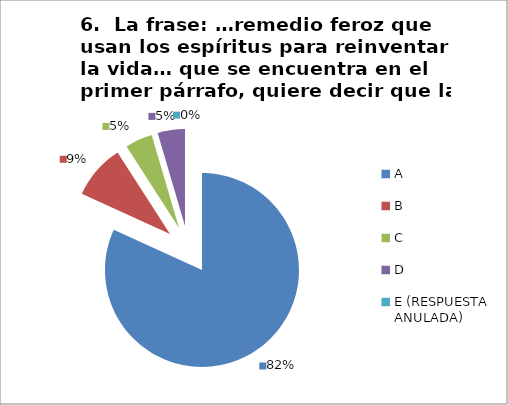
| Category | CANTIDAD DE RESPUESTAS PREGUNTA (6) | PORCENTAJE |
|---|---|---|
| A | 18 | 0.818 |
| B | 2 | 0.091 |
| C | 1 | 0.045 |
| D | 1 | 0.045 |
| E (RESPUESTA ANULADA) | 0 | 0 |